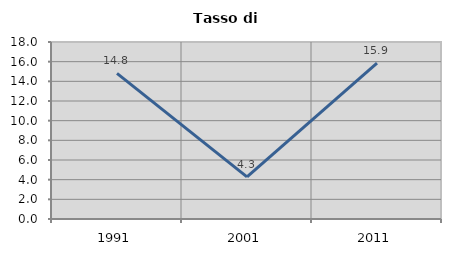
| Category | Tasso di disoccupazione   |
|---|---|
| 1991.0 | 14.815 |
| 2001.0 | 4.286 |
| 2011.0 | 15.854 |